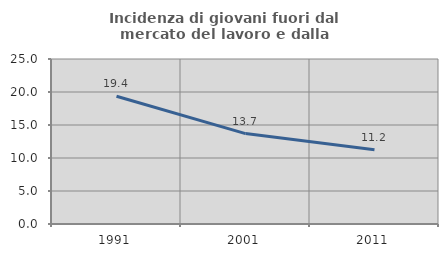
| Category | Incidenza di giovani fuori dal mercato del lavoro e dalla formazione  |
|---|---|
| 1991.0 | 19.355 |
| 2001.0 | 13.696 |
| 2011.0 | 11.233 |